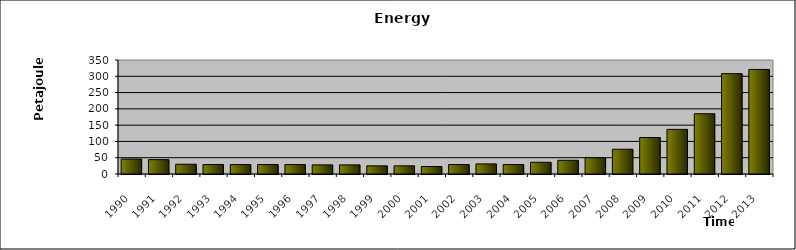
| Category | Series 0 |
|---|---|
| 1990.0 | 46 |
| 1991.0 | 44 |
| 1992.0 | 30 |
| 1993.0 | 29 |
| 1994.0 | 29 |
| 1995.0 | 29 |
| 1996.0 | 29 |
| 1997.0 | 28 |
| 1998.0 | 28 |
| 1999.0 | 25 |
| 2000.0 | 25 |
| 2001.0 | 23 |
| 2002.0 | 29 |
| 2003.0 | 31 |
| 2004.0 | 29 |
| 2005.0 | 36 |
| 2006.0 | 42 |
| 2007.0 | 50 |
| 2008.0 | 76 |
| 2009.0 | 112 |
| 2010.0 | 137 |
| 2011.0 | 185 |
| 2012.0 | 308 |
| 2013.0 | 321 |